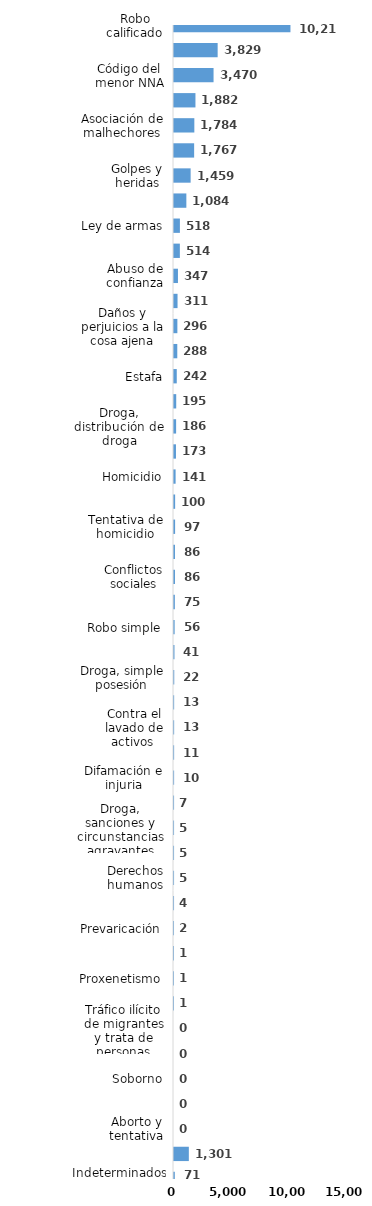
| Category | Series 0 |
|---|---|
| Robo calificado | 10215 |
| Violencia intrafamiliar | 3829 |
| Código del menor NNA | 3470 |
| Crímenes y delitos de alta tecnología | 1882 |
| Asociación de malhechores | 1784 |
| Violencia de género | 1767 |
| Golpes y heridas | 1459 |
| Amenaza | 1084 |
| Ley de armas | 518 |
| Pérdida de documento de identidad | 514 |
| Abuso de confianza | 347 |
| Droga, traficante de droga | 311 |
| Daños y perjuicios a la cosa ajena | 296 |
| Agresión sexual | 288 |
| Estafa | 242 |
| Código de trabajo | 195 |
| Droga, distribución de droga | 186 |
| Desaparición | 173 |
| Homicidio | 141 |
| Violación sexual | 100 |
| Tentativa de homicidio | 97 |
| Protección animal y tenencia responsable | 86 |
| Conflictos sociales | 86 |
| Falsificación | 75 |
| Robo simple | 56 |
| Crímenes y delitos contra la propiedad | 41 |
| Droga, simple posesión | 22 |
| Propiedad industrial, intelectual y derecho de autor | 13 |
| Contra el lavado de activos  | 13 |
| Medio ambiente y recursos naturales | 11 |
| Difamación e injuria | 10 |
| Tránsito y seguridad vial  | 7 |
| Droga, sanciones y circunstancias agravantes | 5 |
| Ley general de salud | 5 |
| Derechos humanos | 5 |
| Secuestro | 4 |
| Prevaricación | 2 |
| Juegos de azar | 1 |
| Proxenetismo | 1 |
| Terrorismo | 1 |
| Tráfico ilícito de migrantes y trata de personas | 0 |
| Ley de cheques | 0 |
| Soborno | 0 |
| Droga, delitos y sanciones | 0 |
| Aborto y tentativa | 0 |
| Otros | 1301 |
| Indeterminados | 71 |